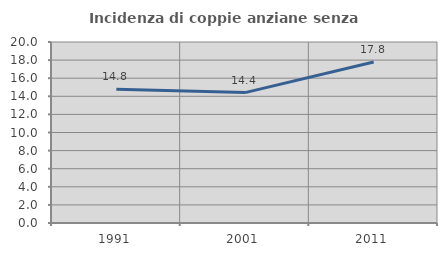
| Category | Incidenza di coppie anziane senza figli  |
|---|---|
| 1991.0 | 14.783 |
| 2001.0 | 14.407 |
| 2011.0 | 17.797 |